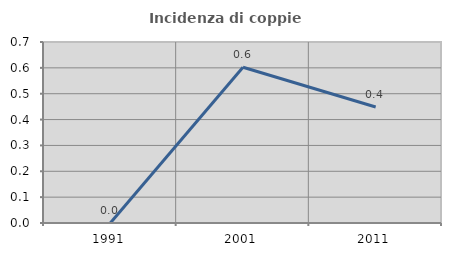
| Category | Incidenza di coppie miste |
|---|---|
| 1991.0 | 0 |
| 2001.0 | 0.602 |
| 2011.0 | 0.449 |